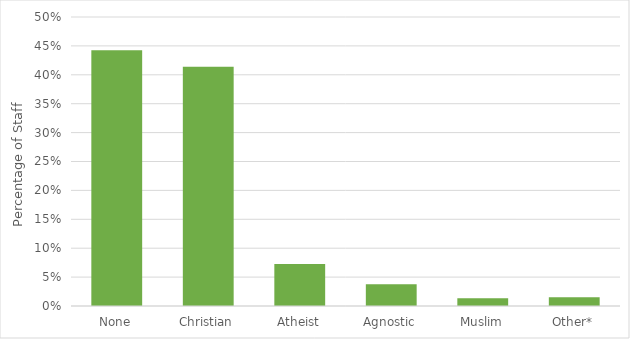
| Category | % of Staff |
|---|---|
| None | 0.443 |
| Christian | 0.414 |
| Atheist | 0.073 |
| Agnostic | 0.038 |
| Muslim | 0.014 |
| Other* | 0.015 |